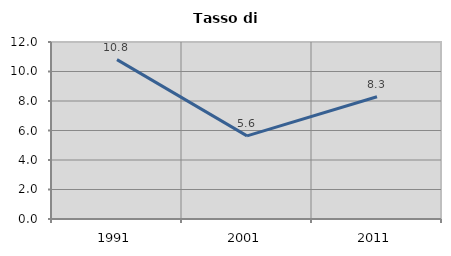
| Category | Tasso di disoccupazione   |
|---|---|
| 1991.0 | 10.806 |
| 2001.0 | 5.638 |
| 2011.0 | 8.291 |